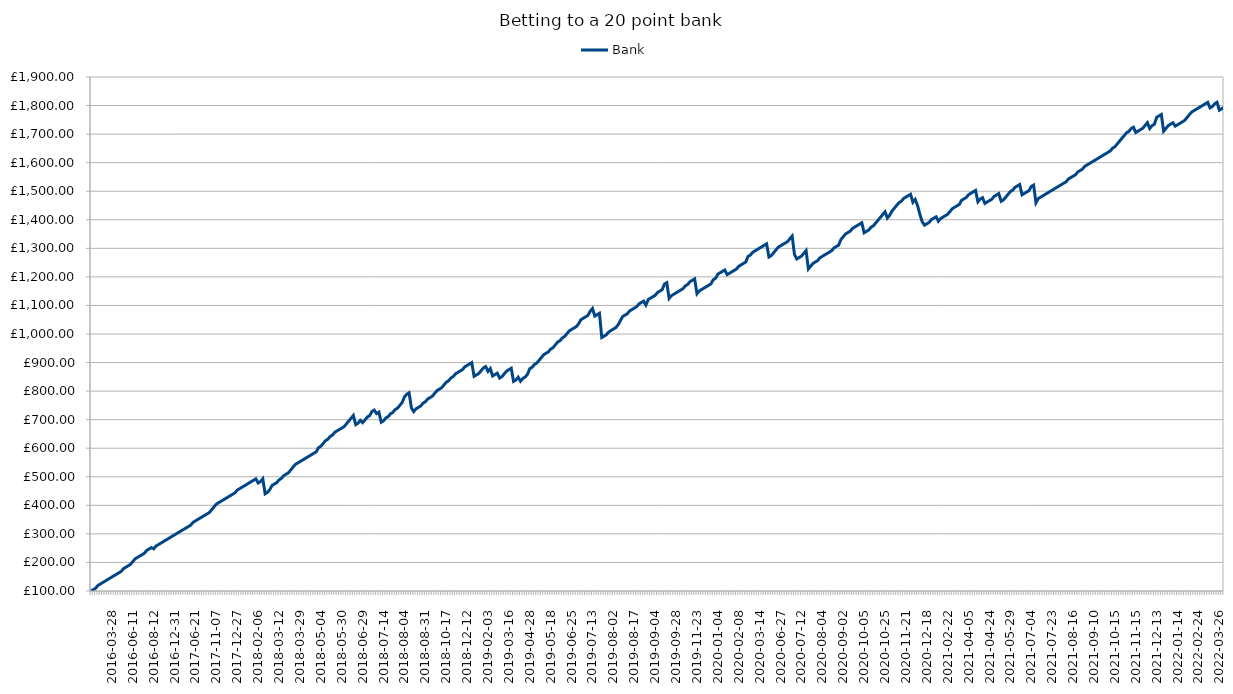
| Category | Bank |
|---|---|
|  | 100 |
| 2016-01-05 | 104.9 |
| 2016-01-14 | 109.8 |
| 2016-01-24 | 119.6 |
| 2016-01-30 | 124.5 |
| 2016-02-18 | 129.4 |
| 2016-02-27 | 134.3 |
| 2016-03-06 | 139.2 |
| 2016-03-17 | 144.1 |
| 2016-03-28 | 149 |
| 2016-03-31 | 153.9 |
| 2016-04-03 | 158.8 |
| 2016-04-05 | 163.7 |
| 2016-04-21 | 168.6 |
| 2016-04-26 | 178.4 |
| 2016-05-02 | 183.3 |
| 2016-05-09 | 188.2 |
| 2016-05-12 | 193.1 |
| 2016-06-11 | 202.9 |
| 2016-06-12 | 212.7 |
| 2016-06-21 | 217.6 |
| 2016-06-24 | 222.5 |
| 2016-06-26 | 227.4 |
| 2016-07-07 | 232.3 |
| 2016-07-24 | 242.1 |
| 2016-08-05 | 247 |
| 2016-08-09 | 251.9 |
| 2016-08-12 | 247.65 |
| 2016-08-13 | 257.45 |
| 2016-08-27 | 262.35 |
| 2016-08-29 | 267.25 |
| 2016-09-13 | 272.15 |
| 2016-09-24 | 277.05 |
| 2016-09-28 | 281.95 |
| 2016-10-11 | 286.85 |
| 2016-11-03 | 291.75 |
| 2016-12-31 | 296.65 |
| 2017-03-13 | 301.55 |
| 2017-03-15 | 306.45 |
| 2017-03-22 | 311.35 |
| 2017-03-26 | 316.25 |
| 2017-04-18 | 321.15 |
| 2017-05-08 | 326.05 |
| 2017-06-08 | 330.95 |
| 2017-06-20 | 340.75 |
| 2017-06-21 | 345.65 |
| 2017-07-08 | 350.55 |
| 2017-07-11 | 355.45 |
| 2017-08-01 | 360.35 |
| 2017-08-12 | 365.25 |
| 2017-08-24 | 370.15 |
| 2017-10-06 | 375.05 |
| 2017-10-11 | 384.85 |
| 2017-10-14 | 394.65 |
| 2017-11-07 | 404.45 |
| 2017-11-11 | 409.35 |
| 2017-11-16 | 414.25 |
| 2017-12-01 | 419.15 |
| 2017-12-02 | 424.05 |
| 2017-12-14 | 428.95 |
| 2017-12-15 | 433.85 |
| 2017-12-16 | 438.75 |
| 2017-12-26 | 443.65 |
| 2017-12-27 | 453.45 |
| 2018-01-04 | 458.35 |
| 2018-01-05 | 463.25 |
| 2018-01-09 | 468.15 |
| 2018-01-22 | 473.05 |
| 2018-01-25 | 477.95 |
| 2018-01-27 | 482.85 |
| 2018-01-29 | 487.75 |
| 2018-01-31 | 492.65 |
| 2018-02-06 | 478.2 |
| 2018-02-07 | 483.1 |
| 2018-02-09 | 492.9 |
| 2018-02-16 | 440.3 |
| 2018-03-03 | 445.2 |
| 2018-03-05 | 455 |
| 2018-03-07 | 469.7 |
| 2018-03-08 | 474.6 |
| 2018-03-11 | 479.5 |
| 2018-03-12 | 489.3 |
| 2018-03-13 | 494.2 |
| 2018-03-14 | 504 |
| 2018-03-16 | 508.9 |
| 2018-03-17 | 513.8 |
| 2018-03-21 | 523.6 |
| 2018-03-22 | 533.4 |
| 2018-03-24 | 543.2 |
| 2018-03-28 | 548.1 |
| 2018-03-29 | 553 |
| 2018-03-31 | 557.9 |
| 2018-04-08 | 562.8 |
| 2018-04-10 | 567.7 |
| 2018-04-14 | 572.6 |
| 2018-04-24 | 577.5 |
| 2018-04-25 | 582.4 |
| 2018-04-28 | 587.3 |
| 2018-05-03 | 602 |
| 2018-05-04 | 606.9 |
| 2018-05-08 | 616.7 |
| 2018-05-12 | 626.5 |
| 2018-05-14 | 631.4 |
| 2018-05-15 | 641.2 |
| 2018-05-16 | 646.1 |
| 2018-05-24 | 655.9 |
| 2018-05-25 | 660.8 |
| 2018-05-28 | 665.7 |
| 2018-05-30 | 670.6 |
| 2018-06-01 | 675.5 |
| 2018-06-04 | 685.3 |
| 2018-06-07 | 695.1 |
| 2018-06-12 | 704.9 |
| 2018-06-18 | 714.7 |
| 2018-06-19 | 682.7 |
| 2018-06-22 | 687.6 |
| 2018-06-27 | 697.4 |
| 2018-06-29 | 689.45 |
| 2018-06-30 | 699.25 |
| 2018-07-03 | 709.05 |
| 2018-07-04 | 713.95 |
| 2018-07-05 | 728.65 |
| 2018-07-08 | 733.55 |
| 2018-07-09 | 721.4 |
| 2018-07-10 | 726.3 |
| 2018-07-11 | 691.2 |
| 2018-07-14 | 696.1 |
| 2018-07-16 | 705.9 |
| 2018-07-17 | 710.8 |
| 2018-07-18 | 720.6 |
| 2018-07-20 | 725.5 |
| 2018-07-23 | 735.3 |
| 2018-07-24 | 740.2 |
| 2018-07-25 | 750 |
| 2018-07-28 | 759.8 |
| 2018-08-04 | 779.4 |
| 2018-08-06 | 789.2 |
| 2018-08-08 | 794.1 |
| 2018-08-16 | 741.6 |
| 2018-08-21 | 728.2 |
| 2018-08-23 | 738 |
| 2018-08-24 | 742.9 |
| 2018-08-25 | 747.8 |
| 2018-08-29 | 757.6 |
| 2018-08-31 | 762.5 |
| 2018-09-04 | 772.3 |
| 2018-09-06 | 777.2 |
| 2018-09-20 | 782.1 |
| 2018-09-23 | 791.9 |
| 2018-09-26 | 801.7 |
| 2018-09-29 | 806.6 |
| 2018-09-30 | 811.5 |
| 2018-10-15 | 821.3 |
| 2018-10-17 | 831.1 |
| 2018-10-23 | 836 |
| 2018-10-29 | 845.8 |
| 2018-11-01 | 850.7 |
| 2018-11-06 | 860.5 |
| 2018-11-15 | 865.4 |
| 2018-11-16 | 870.3 |
| 2018-11-24 | 875.2 |
| 2018-12-09 | 885 |
| 2018-12-12 | 889.9 |
| 2018-12-26 | 894.8 |
| 2019-01-03 | 899.7 |
| 2019-01-10 | 851.7 |
| 2019-01-11 | 856.6 |
| 2019-01-15 | 861.5 |
| 2019-01-19 | 871.3 |
| 2019-01-26 | 881.1 |
| 2019-02-02 | 886 |
| 2019-02-03 | 869.1 |
| 2019-02-08 | 878.9 |
| 2019-02-13 | 852.9 |
| 2019-02-14 | 857.8 |
| 2019-02-18 | 862.7 |
| 2019-02-24 | 845.7 |
| 2019-03-02 | 850.6 |
| 2019-03-06 | 860.4 |
| 2019-03-08 | 870.2 |
| 2019-03-16 | 875.1 |
| 2019-03-18 | 880 |
| 2019-03-21 | 833.95 |
| 2019-03-22 | 838.85 |
| 2019-03-30 | 848.65 |
| 2019-04-07 | 834.55 |
| 2019-04-10 | 844.35 |
| 2019-04-14 | 849.25 |
| 2019-04-26 | 859.05 |
| 2019-04-28 | 878.65 |
| 2019-04-29 | 883.55 |
| 2019-05-03 | 893.35 |
| 2019-05-06 | 898.25 |
| 2019-05-10 | 908.05 |
| 2019-05-11 | 917.85 |
| 2019-05-12 | 927.65 |
| 2019-05-14 | 932.55 |
| 2019-05-16 | 937.45 |
| 2019-05-18 | 947.25 |
| 2019-05-25 | 952.15 |
| 2019-05-29 | 961.95 |
| 2019-06-02 | 971.75 |
| 2019-06-03 | 976.65 |
| 2019-06-08 | 986.45 |
| 2019-06-11 | 991.35 |
| 2019-06-15 | 1001.15 |
| 2019-06-22 | 1010.95 |
| 2019-06-25 | 1015.85 |
| 2019-06-28 | 1020.75 |
| 2019-06-29 | 1025.65 |
| 2019-07-01 | 1035.45 |
| 2019-07-04 | 1050.15 |
| 2019-07-05 | 1055.05 |
| 2019-07-06 | 1059.95 |
| 2019-07-10 | 1064.85 |
| 2019-07-12 | 1079.55 |
| 2019-07-13 | 1089.35 |
| 2019-07-17 | 1062.8 |
| 2019-07-18 | 1067.7 |
| 2019-07-20 | 1072.6 |
| 2019-07-24 | 987.7 |
| 2019-07-26 | 992.6 |
| 2019-07-27 | 997.5 |
| 2019-07-28 | 1007.3 |
| 2019-07-31 | 1012.2 |
| 2019-08-02 | 1017.1 |
| 2019-08-04 | 1022 |
| 2019-08-05 | 1031.8 |
| 2019-08-07 | 1046.5 |
| 2019-08-09 | 1061.2 |
| 2019-08-12 | 1066.1 |
| 2019-08-14 | 1071 |
| 2019-08-15 | 1080.8 |
| 2019-08-16 | 1085.7 |
| 2019-08-17 | 1090.6 |
| 2019-08-21 | 1095.5 |
| 2019-08-22 | 1105.3 |
| 2019-08-24 | 1110.2 |
| 2019-08-26 | 1115.1 |
| 2019-08-27 | 1101.2 |
| 2019-08-28 | 1120.8 |
| 2019-08-29 | 1125.7 |
| 2019-09-03 | 1130.6 |
| 2019-09-04 | 1135.5 |
| 2019-09-09 | 1145.3 |
| 2019-09-10 | 1150.2 |
| 2019-09-16 | 1155.1 |
| 2019-09-19 | 1174.7 |
| 2019-09-20 | 1179.6 |
| 2019-09-21 | 1124.5 |
| 2019-09-25 | 1134.3 |
| 2019-09-27 | 1139.2 |
| 2019-09-28 | 1144.1 |
| 2019-09-29 | 1149 |
| 2019-10-16 | 1153.9 |
| 2019-10-18 | 1158.8 |
| 2019-10-23 | 1168.6 |
| 2019-10-28 | 1173.5 |
| 2019-10-29 | 1183.3 |
| 2019-10-31 | 1188.2 |
| 2019-11-16 | 1193.1 |
| 2019-11-23 | 1141.05 |
| 2019-12-05 | 1150.85 |
| 2019-12-06 | 1155.75 |
| 2019-12-09 | 1160.65 |
| 2019-12-11 | 1165.55 |
| 2019-12-12 | 1170.45 |
| 2019-12-15 | 1175.35 |
| 2020-01-02 | 1190.05 |
| 2020-01-03 | 1194.95 |
| 2020-01-04 | 1209.65 |
| 2020-01-09 | 1214.55 |
| 2020-01-18 | 1219.45 |
| 2020-01-19 | 1224.35 |
| 2020-01-22 | 1207.85 |
| 2020-01-28 | 1212.75 |
| 2020-02-03 | 1217.65 |
| 2020-02-06 | 1222.55 |
| 2020-02-07 | 1227.45 |
| 2020-02-08 | 1237.25 |
| 2020-02-12 | 1242.15 |
| 2020-02-17 | 1247.05 |
| 2020-02-19 | 1251.95 |
| 2020-02-22 | 1271.55 |
| 2020-02-28 | 1276.45 |
| 2020-02-29 | 1286.25 |
| 2020-03-05 | 1291.15 |
| 2020-03-06 | 1296.05 |
| 2020-03-14 | 1300.95 |
| 2020-03-20 | 1305.85 |
| 2020-06-08 | 1310.75 |
| 2020-06-12 | 1315.65 |
| 2020-06-13 | 1269.65 |
| 2020-06-14 | 1274.55 |
| 2020-06-15 | 1284.35 |
| 2020-06-22 | 1294.15 |
| 2020-06-26 | 1303.95 |
| 2020-06-27 | 1308.85 |
| 2020-06-28 | 1313.75 |
| 2020-06-30 | 1318.65 |
| 2020-07-01 | 1323.55 |
| 2020-07-02 | 1333.35 |
| 2020-07-03 | 1343.15 |
| 2020-07-04 | 1278.15 |
| 2020-07-08 | 1262.75 |
| 2020-07-11 | 1267.65 |
| 2020-07-12 | 1272.55 |
| 2020-07-20 | 1282.35 |
| 2020-07-22 | 1292.15 |
| 2020-07-23 | 1227.85 |
| 2020-07-25 | 1237.65 |
| 2020-07-29 | 1247.45 |
| 2020-07-30 | 1252.35 |
| 2020-08-01 | 1257.25 |
| 2020-08-02 | 1267.05 |
| 2020-08-04 | 1271.95 |
| 2020-08-06 | 1276.85 |
| 2020-08-14 | 1281.75 |
| 2020-08-19 | 1286.65 |
| 2020-08-20 | 1291.55 |
| 2020-08-24 | 1301.35 |
| 2020-08-26 | 1306.25 |
| 2020-08-27 | 1311.15 |
| 2020-08-31 | 1330.75 |
| 2020-09-02 | 1340.55 |
| 2020-09-09 | 1350.35 |
| 2020-09-14 | 1355.25 |
| 2020-09-17 | 1360.15 |
| 2020-09-19 | 1369.95 |
| 2020-09-20 | 1374.85 |
| 2020-09-25 | 1379.75 |
| 2020-09-27 | 1384.65 |
| 2020-09-30 | 1389.55 |
| 2020-10-05 | 1354.55 |
| 2020-10-07 | 1359.45 |
| 2020-10-08 | 1364.35 |
| 2020-10-09 | 1374.15 |
| 2020-10-13 | 1379.05 |
| 2020-10-15 | 1388.85 |
| 2020-10-18 | 1398.65 |
| 2020-10-22 | 1408.45 |
| 2020-10-24 | 1418.25 |
| 2020-10-25 | 1428.05 |
| 2020-10-26 | 1406.05 |
| 2020-10-28 | 1415.85 |
| 2020-10-29 | 1430.55 |
| 2020-10-31 | 1440.35 |
| 2020-11-03 | 1450.15 |
| 2020-11-12 | 1459.95 |
| 2020-11-15 | 1464.85 |
| 2020-11-18 | 1474.65 |
| 2020-11-21 | 1479.55 |
| 2020-11-25 | 1484.45 |
| 2020-11-26 | 1489.35 |
| 2020-11-27 | 1461.35 |
| 2020-11-29 | 1471.15 |
| 2020-12-04 | 1450.45 |
| 2020-12-11 | 1419.45 |
| 2020-12-16 | 1393.15 |
| 2020-12-17 | 1381.05 |
| 2020-12-18 | 1385.95 |
| 2020-12-22 | 1390.85 |
| 2020-12-30 | 1400.65 |
| 2021-01-01 | 1405.55 |
| 2021-01-02 | 1410.45 |
| 2021-01-05 | 1394.95 |
| 2021-01-09 | 1404.75 |
| 2021-01-20 | 1409.65 |
| 2021-02-19 | 1414.55 |
| 2021-02-22 | 1419.45 |
| 2021-02-25 | 1429.25 |
| 2021-02-26 | 1439.05 |
| 2021-02-27 | 1443.95 |
| 2021-03-01 | 1448.85 |
| 2021-03-07 | 1453.75 |
| 2021-03-10 | 1468.45 |
| 2021-03-14 | 1473.35 |
| 2021-03-21 | 1478.25 |
| 2021-04-05 | 1488.05 |
| 2021-04-06 | 1492.95 |
| 2021-04-08 | 1497.85 |
| 2021-04-10 | 1502.75 |
| 2021-04-13 | 1462.8 |
| 2021-04-14 | 1472.6 |
| 2021-04-19 | 1477.5 |
| 2021-04-22 | 1457.45 |
| 2021-04-23 | 1462.35 |
| 2021-04-24 | 1467.25 |
| 2021-04-26 | 1472.15 |
| 2021-05-02 | 1481.95 |
| 2021-05-03 | 1486.85 |
| 2021-05-08 | 1491.75 |
| 2021-05-09 | 1464.75 |
| 2021-05-13 | 1469.65 |
| 2021-05-18 | 1479.45 |
| 2021-05-25 | 1489.25 |
| 2021-05-29 | 1499.05 |
| 2021-05-30 | 1503.95 |
| 2021-06-01 | 1513.75 |
| 2021-06-02 | 1518.65 |
| 2021-06-06 | 1523.55 |
| 2021-06-18 | 1487.3 |
| 2021-06-19 | 1492.2 |
| 2021-07-01 | 1497.1 |
| 2021-07-02 | 1502 |
| 2021-07-04 | 1516.7 |
| 2021-07-07 | 1521.6 |
| 2021-07-08 | 1459.6 |
| 2021-07-13 | 1474.3 |
| 2021-07-15 | 1479.2 |
| 2021-07-18 | 1484.1 |
| 2021-07-19 | 1489 |
| 2021-07-20 | 1493.9 |
| 2021-07-22 | 1498.8 |
| 2021-07-23 | 1503.7 |
| 2021-07-24 | 1508.6 |
| 2021-07-26 | 1513.5 |
| 2021-07-27 | 1518.4 |
| 2021-07-29 | 1523.3 |
| 2021-07-30 | 1528.2 |
| 2021-07-31 | 1533.1 |
| 2021-08-05 | 1542.9 |
| 2021-08-06 | 1547.8 |
| 2021-08-16 | 1552.7 |
| 2021-08-17 | 1557.6 |
| 2021-08-22 | 1567.4 |
| 2021-08-31 | 1572.3 |
| 2021-09-01 | 1577.2 |
| 2021-09-03 | 1587 |
| 2021-09-04 | 1591.9 |
| 2021-09-07 | 1596.8 |
| 2021-09-09 | 1601.7 |
| 2021-09-10 | 1606.6 |
| 2021-09-14 | 1611.5 |
| 2021-09-16 | 1616.4 |
| 2021-09-17 | 1621.3 |
| 2021-09-23 | 1626.2 |
| 2021-09-28 | 1631.1 |
| 2021-09-29 | 1636 |
| 2021-10-01 | 1640.9 |
| 2021-10-02 | 1650.7 |
| 2021-10-15 | 1655.6 |
| 2021-10-16 | 1665.4 |
| 2021-10-18 | 1675.2 |
| 2021-10-25 | 1685 |
| 2021-10-27 | 1694.8 |
| 2021-10-28 | 1704.6 |
| 2021-11-02 | 1709.5 |
| 2021-11-08 | 1719.3 |
| 2021-11-13 | 1724.2 |
| 2021-11-15 | 1705.75 |
| 2021-11-17 | 1710.65 |
| 2021-11-18 | 1715.55 |
| 2021-11-20 | 1720.45 |
| 2021-11-23 | 1730.25 |
| 2021-11-25 | 1740.05 |
| 2021-11-26 | 1719.75 |
| 2021-12-09 | 1729.55 |
| 2021-12-11 | 1734.45 |
| 2021-12-13 | 1758.95 |
| 2021-12-18 | 1763.85 |
| 2021-12-26 | 1768.75 |
| 2021-12-27 | 1710.35 |
| 2021-12-28 | 1720.15 |
| 2022-01-02 | 1729.95 |
| 2022-01-09 | 1734.85 |
| 2022-01-12 | 1739.75 |
| 2022-01-13 | 1727.95 |
| 2022-01-14 | 1732.85 |
| 2022-01-23 | 1737.75 |
| 2022-01-31 | 1742.65 |
| 2022-02-06 | 1747.55 |
| 2022-02-10 | 1757.35 |
| 2022-02-12 | 1767.15 |
| 2022-02-15 | 1776.95 |
| 2022-02-16 | 1781.85 |
| 2022-02-19 | 1786.75 |
| 2022-02-24 | 1791.65 |
| 2022-02-26 | 1796.55 |
| 2022-02-27 | 1801.45 |
| 2022-03-04 | 1806.35 |
| 2022-03-10 | 1811.25 |
| 2022-03-11 | 1791.85 |
| 2022-03-14 | 1796.75 |
| 2022-03-16 | 1806.55 |
| 2022-03-20 | 1811.45 |
| 2022-03-26 | 1783.8 |
| 2022-03-27 | 1788.7 |
| 2022-03-28 | 1793.6 |